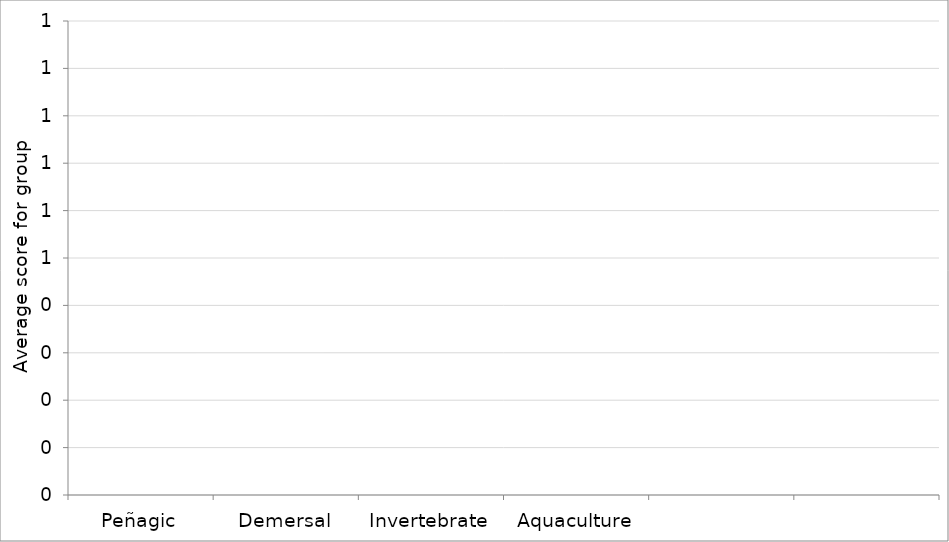
| Category | Series 0 |
|---|---|
| Peñagic | 0 |
| Demersal | 0 |
| Invertebrate | 0 |
| Aquaculture | 0 |